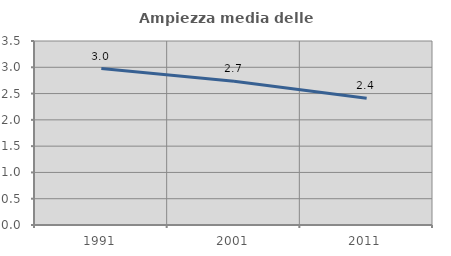
| Category | Ampiezza media delle famiglie |
|---|---|
| 1991.0 | 2.975 |
| 2001.0 | 2.734 |
| 2011.0 | 2.411 |